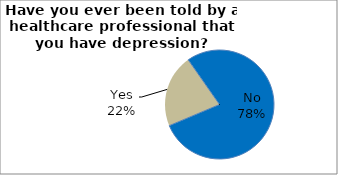
| Category | Series 0 |
|---|---|
| No | 78.371 |
| Yes | 21.629 |